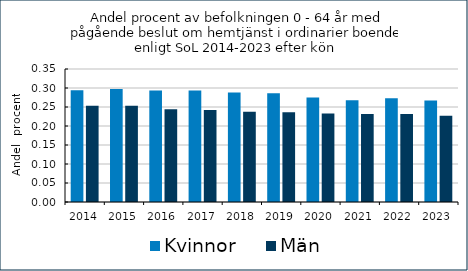
| Category | Kvinnor    | Män   |
|---|---|---|
| 2014.0 | 0.294 | 0.253 |
| 2015.0 | 0.298 | 0.254 |
| 2016.0 | 0.293 | 0.244 |
| 2017.0 | 0.293 | 0.242 |
| 2018.0 | 0.288 | 0.238 |
| 2019.0 | 0.286 | 0.236 |
| 2020.0 | 0.275 | 0.233 |
| 2021.0 | 0.268 | 0.232 |
| 2022.0 | 0.273 | 0.231 |
| 2023.0 | 0.267 | 0.227 |